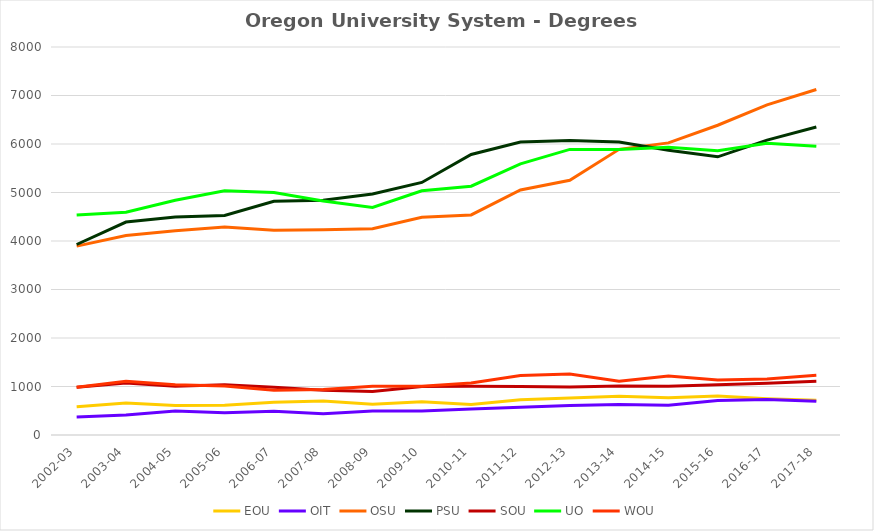
| Category | EOU | OIT | OSU | PSU | SOU | UO | WOU |
|---|---|---|---|---|---|---|---|
| 2002-03 | 580 | 369 | 3894 | 3928 | 985 | 4534 | 984 |
| 2003-04 | 660 | 410 | 4113 | 4390 | 1073 | 4593 | 1110 |
| 2004-05 | 607 | 496 | 4213 | 4496 | 1005 | 4839 | 1038 |
| 2005-06 | 611 | 461 | 4290 | 4528 | 1036 | 5036 | 1012 |
| 2006-07 | 673 | 492 | 4222 | 4819 | 986 | 4999 | 925 |
| 2007-08 | 701 | 438 | 4232 | 4840 | 923 | 4825 | 938 |
| 2008-09 | 633 | 495 | 4254 | 4970 | 896 | 4693 | 1003 |
| 2009-10 | 685 | 497 | 4490 | 5207 | 1000 | 5036 | 1005 |
| 2010-11 | 627 | 538 | 4538 | 5784 | 1006 | 5130 | 1071 |
| 2011-12 | 726 | 572 | 5052 | 6039 | 1002 | 5589 | 1229 |
| 2012-13 | 764 | 606 | 5253 | 6074 | 988 | 5889 | 1256 |
| 2013-14 | 799 | 627 | 5890 | 6040 | 1011 | 5885 | 1107 |
| 2014-15 | 768 | 615 | 6023 | 5871 | 1003 | 5932 | 1217 |
| 2015-16 | 805 | 709 | 6387 | 5736 | 1037 | 5860 | 1133 |
| 2016-17 | 749 | 733 | 6807 | 6079 | 1069 | 6014 | 1154 |
| 2017-18 | 715 | 696 | 7123 | 6350 | 1107 | 5952 | 1231 |